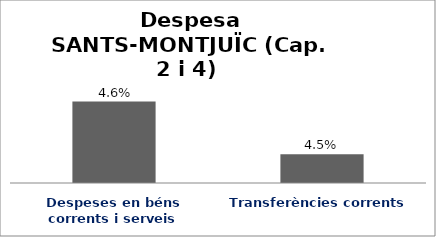
| Category | Series 0 |
|---|---|
| Despeses en béns corrents i serveis | 0.046 |
| Transferències corrents | 0.045 |